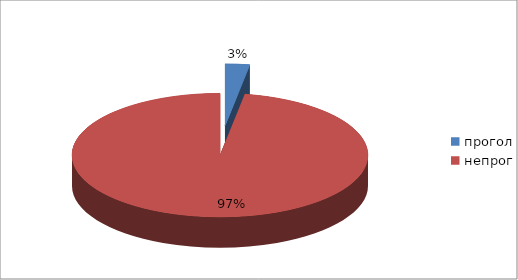
| Category | Series 0 |
|---|---|
| прогол | 4 |
| непрог | 146 |